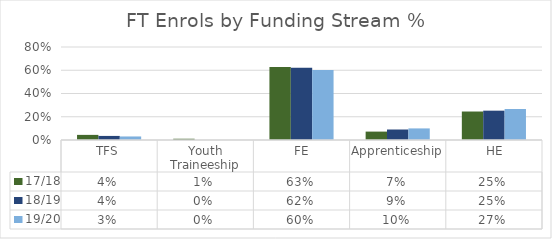
| Category | 17/18 | 18/19 | 19/20 |
|---|---|---|---|
| TFS | 0.044 | 0.035 | 0.03 |
| Youth Traineeship | 0.011 | 0 | 0 |
|  FE | 0.628 | 0.622 | 0.603 |
| Apprenticeship | 0.072 | 0.09 | 0.1 |
|  HE | 0.245 | 0.252 | 0.267 |